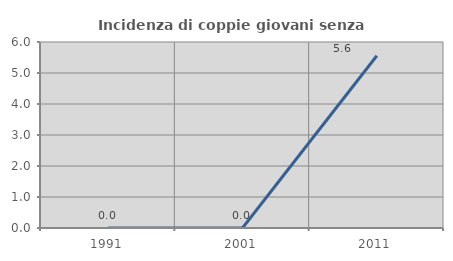
| Category | Incidenza di coppie giovani senza figli |
|---|---|
| 1991.0 | 0 |
| 2001.0 | 0 |
| 2011.0 | 5.556 |